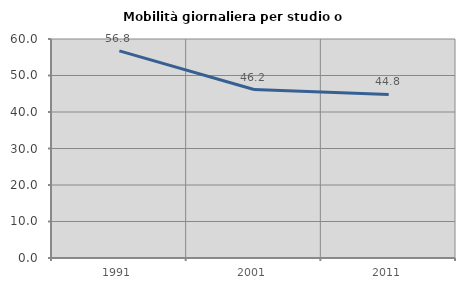
| Category | Mobilità giornaliera per studio o lavoro |
|---|---|
| 1991.0 | 56.757 |
| 2001.0 | 46.154 |
| 2011.0 | 44.828 |